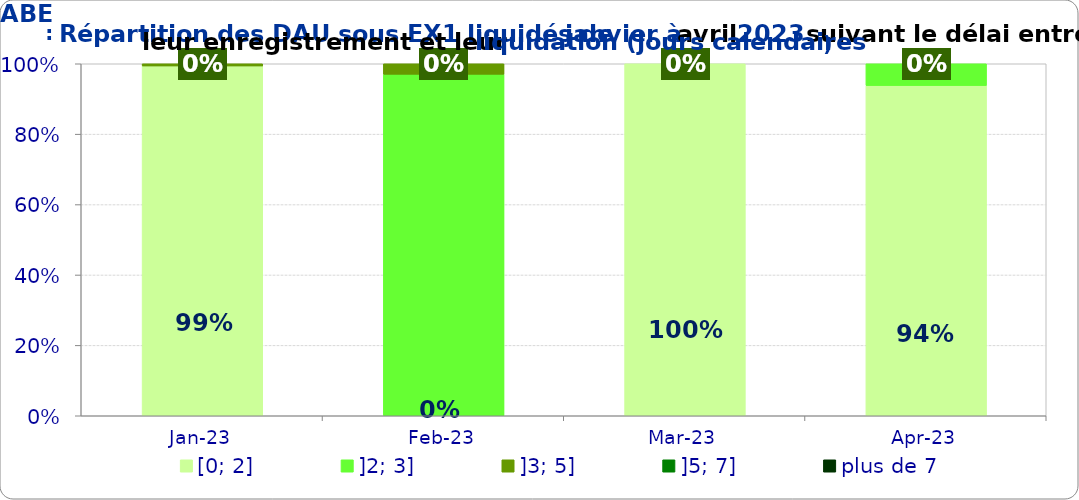
| Category | [0; 2] | ]2; 3] | ]3; 5] | ]5; 7] | plus de 7 |
|---|---|---|---|---|---|
| 2023-01-01 | 0.994 | 0 | 0.006 | 0 | 0 |
| 2023-02-01 | 0 | 0.97 | 0.03 | 0 | 0 |
| 2023-03-01 | 1 | 0 | 0 | 0 | 0 |
| 2023-04-01 | 0.938 | 0.062 | 0 | 0 | 0 |